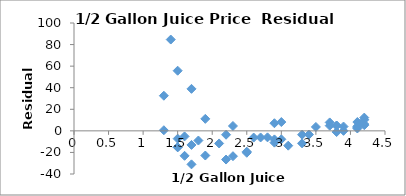
| Category | Series 0 |
|---|---|
| 1.5 | -15.24 |
| 3.9 | 4.003 |
| 3.8 | 4.91 |
| 1.9 | -22.866 |
| 4.2 | 6.284 |
| 4.1 | 8.19 |
| 2.7 | -6.119 |
| 2.2 | -26.586 |
| 1.9 | 11.134 |
| 3.7 | 7.816 |
| 1.3 | 32.573 |
| 1.6 | -23.147 |
| 3.0 | -7.838 |
| 3.8 | 4.91 |
| 1.5 | -15.24 |
| 3.1 | -13.745 |
| 3.5 | 3.629 |
| 2.9 | 7.068 |
| 4.1 | 3.19 |
| 3.3 | -11.558 |
| 2.9 | -7.932 |
| 2.8 | -6.025 |
| 2.6 | -6.212 |
| 2.3 | -23.492 |
| 4.1 | 2.19 |
| 4.2 | 5.284 |
| 3.4 | -3.464 |
| 1.7 | -31.053 |
| 1.6 | -5.147 |
| 1.7 | 38.947 |
| 1.5 | -7.24 |
| 4.2 | 12.284 |
| 1.7 | -13.053 |
| 3.9 | 0.003 |
| 1.5 | 55.76 |
| 3.0 | 8.162 |
| 2.5 | -19.305 |
| 3.8 | -1.09 |
| 2.3 | 4.508 |
| 2.5 | -20.305 |
| 1.8 | -8.96 |
| 1.3 | 0.573 |
| 4.1 | 4.19 |
| 2.1 | -11.679 |
| 1.4 | 84.666 |
| 2.9 | -10.932 |
| 2.2 | -3.586 |
| 3.3 | -3.558 |
| 3.7 | 4.816 |
| 4.2 | 10.284 |